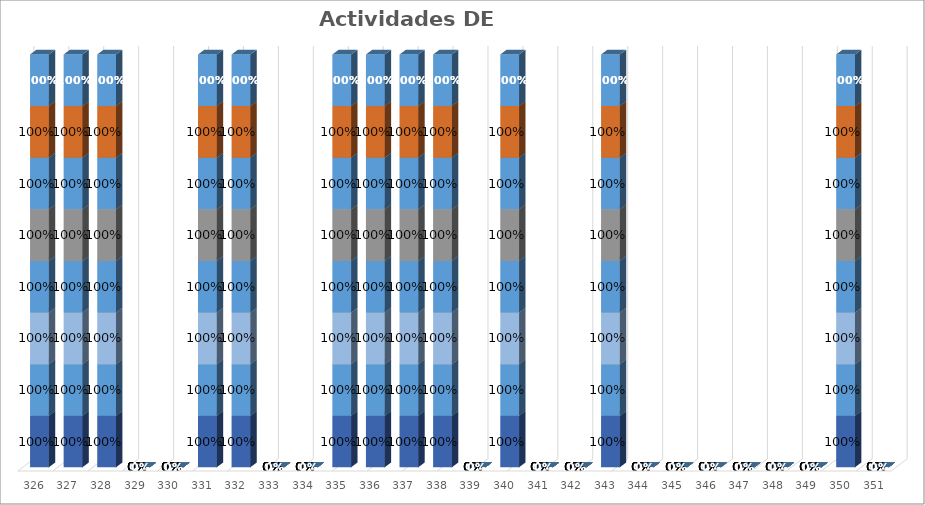
| Category | % Avance |
|---|---|
| 326.0 | 1 |
| 327.0 | 1 |
| 328.0 | 1 |
| 329.0 | 0 |
| 330.0 | 0 |
| 331.0 | 1 |
| 332.0 | 1 |
| 333.0 | 0 |
| 334.0 | 0 |
| 335.0 | 1 |
| 336.0 | 1 |
| 337.0 | 1 |
| 338.0 | 1 |
| 339.0 | 0 |
| 340.0 | 1 |
| 341.0 | 0 |
| 342.0 | 0 |
| 343.0 | 1 |
| 344.0 | 0 |
| 345.0 | 0 |
| 346.0 | 0 |
| 347.0 | 0 |
| 348.0 | 0 |
| 349.0 | 0 |
| 350.0 | 1 |
| 351.0 | 0 |